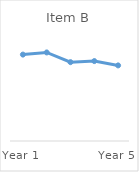
| Category | Item B |
|---|---|
| Year 1 | 0.8 |
| Year 2 | 0.82 |
| Year 3 | 0.73 |
| Year 4 | 0.74 |
| Year 5 | 0.7 |